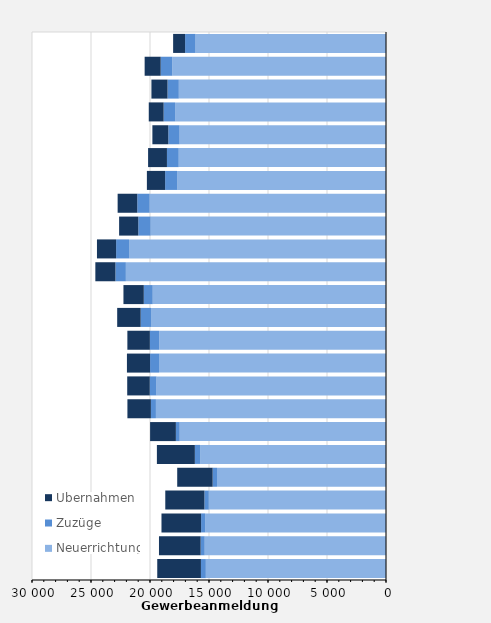
| Category | Neuerrichtungen² | Zuzüge | Übernahmen |
|---|---|---|---|
| 1997.0 | 15269 | 415 | 3702 |
| 1998.0 | 15365 | 343 | 3531 |
| 1999.0 | 15331 | 339 | 3357 |
| 2000.0 | 15016 | 373 | 3316 |
| 2001.0 | 14323 | 368 | 3003 |
| 2002.0 | 15755 | 444 | 3217 |
| 2003.0 | 17485 | 322 | 2185 |
| 2004.0 | 19499 | 426 | 1989 |
| 2005.0 | 19452 | 567 | 1912 |
| 2006.0 | 19238 | 757 | 1960 |
| 2007.0 | 19225 | 786 | 1907 |
| 2008.0 | 19914 | 876 | 1991 |
| 2009.0 | 19769 | 757 | 1724 |
| 2010.0 | 22046 | 885 | 1701 |
| 2011.0 | 21777 | 1095 | 1623 |
| 2012.0 | 19945 | 1049 | 1624 |
| 2013.0 | 20029 | 1051 | 1663 |
| 2014.0 | 17706 | 1013 | 1545 |
| 2015.0 | 17566 | 998 | 1598 |
| 2016.0 | 17492 | 957 | 1349 |
| 2017.0 | 17874 | 972 | 1259 |
| 2018.0 | 17558 | 958 | 1364 |
| 2019.0 | 18108 | 986 | 1360 |
| 2020.0 | 16141 | 885 | 1014 |